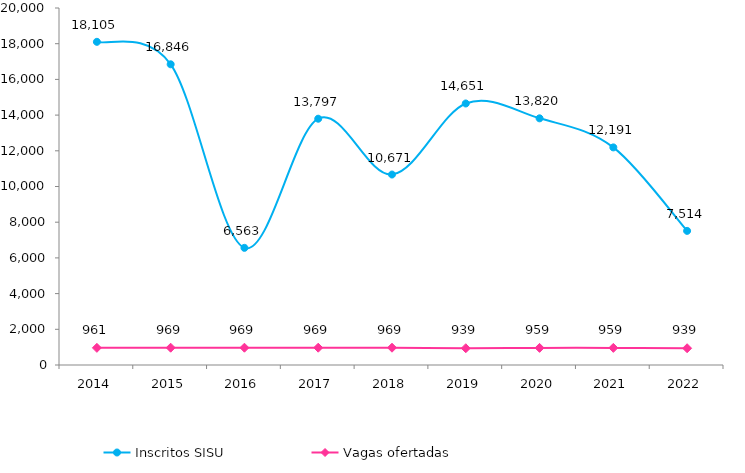
| Category | Inscritos SISU |
|---|---|
| 2014.0 | 18105 |
| 2015.0 | 16846 |
| 2016.0 | 6563 |
| 2017.0 | 13797 |
| 2018.0 | 10671 |
| 2019.0 | 14651 |
| 2020.0 | 13820 |
| 2021.0 | 12191 |
| 2022.0 | 7514 |